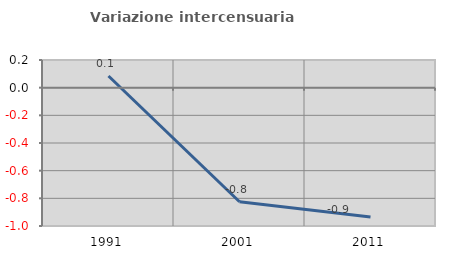
| Category | Variazione intercensuaria annua |
|---|---|
| 1991.0 | 0.084 |
| 2001.0 | -0.824 |
| 2011.0 | -0.935 |